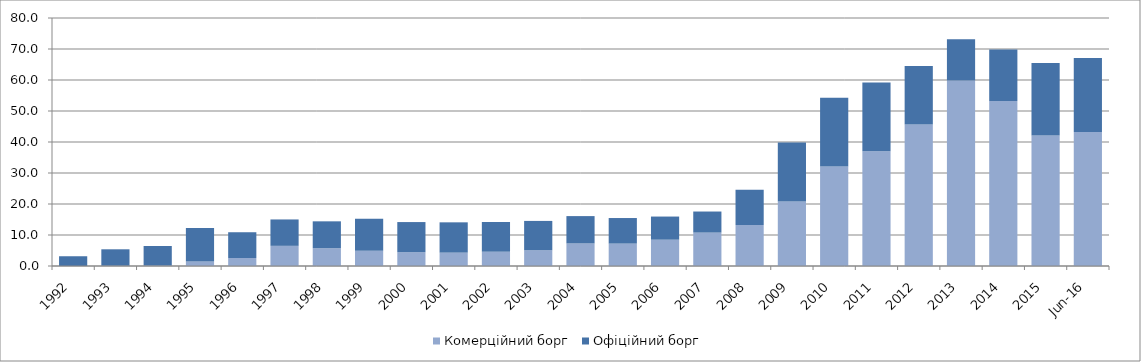
| Category | Комерційний борг | Офіційний борг |
|---|---|---|
| 1992.0 | 0.002 | 3.145 |
| 1993.0 | 0.093 | 5.294 |
| 1994.0 | 0.141 | 6.319 |
| 1995.0 | 1.452 | 10.845 |
| 1996.0 | 2.584 | 8.306 |
| 1997.0 | 6.501 | 8.515 |
| 1998.0 | 5.762 | 8.647 |
| 1999.0 | 4.91 | 10.338 |
| 2000.0 | 4.437 | 9.735 |
| 2001.0 | 4.31 | 9.775 |
| 2002.0 | 4.609 | 9.593 |
| 2003.0 | 5.066 | 9.477 |
| 2004.0 | 7.274 | 8.823 |
| 2005.0 | 7.225 | 8.249 |
| 2006.0 | 8.489 | 7.461 |
| 2007.0 | 10.762 | 6.811 |
| 2008.0 | 13.215 | 11.384 |
| 2009.0 | 20.831 | 18.982 |
| 2010.0 | 32.087 | 22.211 |
| 2011.0 | 37.025 | 22.198 |
| 2012.0 | 45.621 | 18.875 |
| 2013.0 | 59.842 | 13.321 |
| 2014.0 | 53.19 | 16.622 |
| 2015.0 | 42.095 | 23.41 |
| 42551.0 | 43.223 | 23.893 |